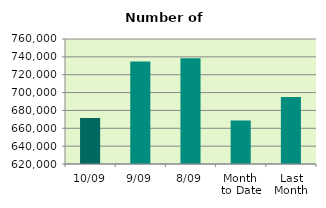
| Category | Series 0 |
|---|---|
| 10/09 | 671514 |
| 9/09 | 734768 |
| 8/09 | 738558 |
| Month 
to Date | 668710.75 |
| Last
Month | 695004.455 |